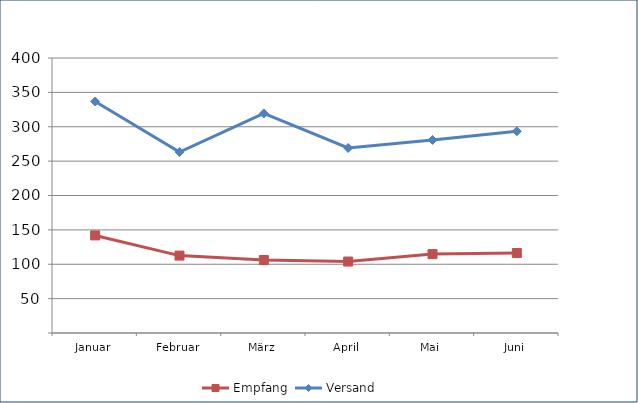
| Category | Empfang | Versand |
|---|---|---|
| Januar | 141.927 | 336.751 |
| Februar | 112.587 | 263.233 |
| März | 106.174 | 319.341 |
| April | 103.95 | 269.121 |
| Mai | 114.766 | 280.812 |
| Juni | 116.302 | 293.391 |